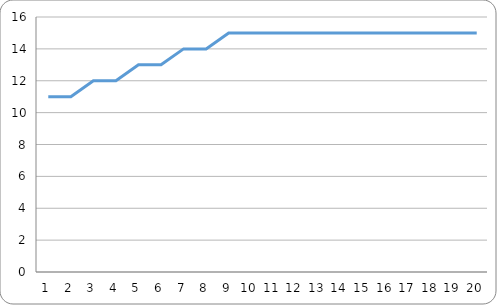
| Category | average |
|---|---|
| 0 | 11 |
| 1 | 11 |
| 2 | 12 |
| 3 | 12 |
| 4 | 13 |
| 5 | 13 |
| 6 | 14 |
| 7 | 14 |
| 8 | 15 |
| 9 | 15 |
| 10 | 15 |
| 11 | 15 |
| 12 | 15 |
| 13 | 15 |
| 14 | 15 |
| 15 | 15 |
| 16 | 15 |
| 17 | 15 |
| 18 | 15 |
| 19 | 15 |